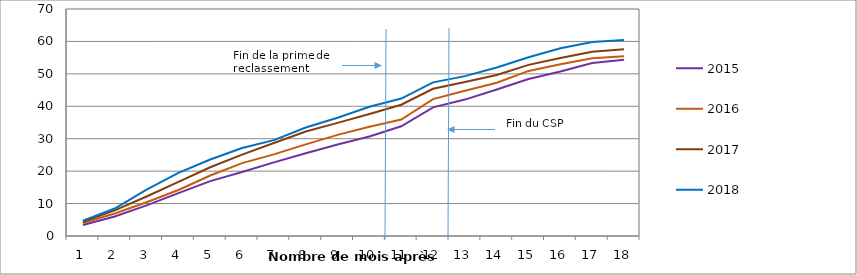
| Category | 2015 | 2016 | 2017 | 2018 |
|---|---|---|---|---|
| 0 | 3.367 | 3.988 | 4.355 | 4.704 |
| 1 | 6.033 | 6.956 | 7.889 | 8.479 |
| 2 | 9.433 | 10.412 | 12.193 | 14.286 |
| 3 | 13.233 | 14.178 | 16.701 | 19.454 |
| 4 | 16.933 | 18.653 | 21.209 | 23.577 |
| 5 | 19.733 | 22.463 | 25.102 | 27.12 |
| 6 | 22.699 | 25.166 | 28.689 | 29.559 |
| 7 | 25.499 | 28.268 | 32.223 | 33.449 |
| 8 | 28.199 | 31.192 | 34.887 | 36.469 |
| 9 | 30.666 | 33.717 | 37.602 | 39.837 |
| 10 | 33.832 | 35.933 | 40.471 | 42.393 |
| 11 | 39.665 | 42.224 | 45.389 | 47.387 |
| 12 | 42.065 | 44.794 | 47.49 | 49.303 |
| 13 | 45.198 | 47.275 | 49.641 | 51.974 |
| 14 | 48.398 | 50.908 | 52.766 | 55.11 |
| 15 | 50.732 | 52.991 | 54.867 | 57.898 |
| 16 | 53.332 | 54.807 | 56.814 | 59.814 |
| 17 | 54.365 | 55.428 | 57.582 | 60.453 |